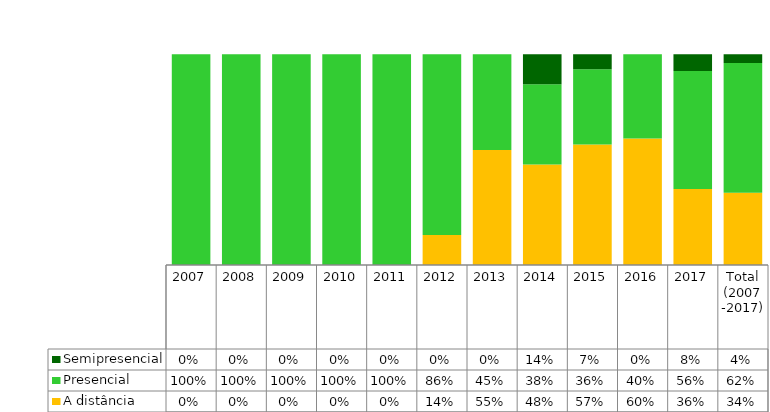
| Category | A distância | Presencial | Semipresencial |
|---|---|---|---|
| 2007 | 0 | 1 | 0 |
| 2008 | 0 | 1 | 0 |
| 2009 | 0 | 1 | 0 |
| 2010 | 0 | 1 | 0 |
| 2011 | 0 | 1 | 0 |
| 2012 | 0.143 | 0.857 | 0 |
| 2013 | 0.545 | 0.455 | 0 |
| 2014 | 0.476 | 0.381 | 0.143 |
| 2015 | 0.571 | 0.357 | 0.071 |
| 2016 | 0.6 | 0.4 | 0 |
| 2017 | 0.36 | 0.56 | 0.08 |
| Total (2007 -2017) | 0.343 | 0.615 | 0.042 |